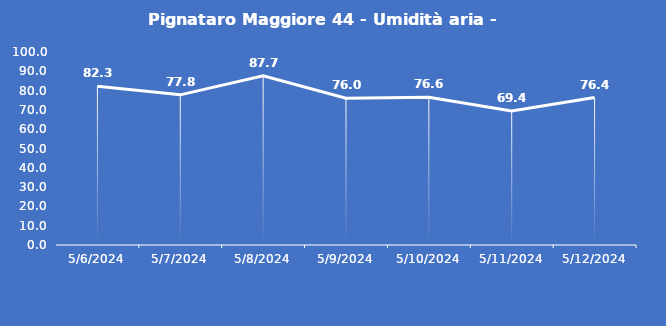
| Category | Pignataro Maggiore 44 - Umidità aria - Grezzo (%) |
|---|---|
| 5/6/24 | 82.3 |
| 5/7/24 | 77.8 |
| 5/8/24 | 87.7 |
| 5/9/24 | 76 |
| 5/10/24 | 76.6 |
| 5/11/24 | 69.4 |
| 5/12/24 | 76.4 |